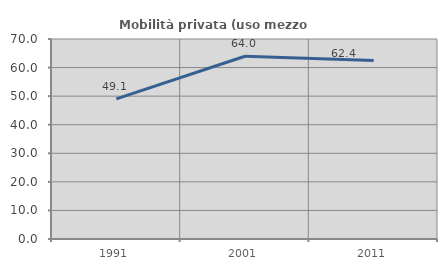
| Category | Mobilità privata (uso mezzo privato) |
|---|---|
| 1991.0 | 49.057 |
| 2001.0 | 63.959 |
| 2011.0 | 62.437 |